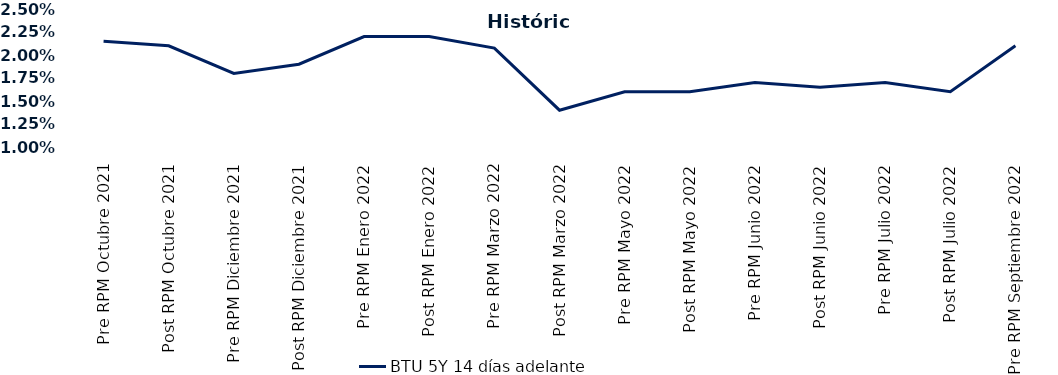
| Category | BTU 5Y 14 días adelante |
|---|---|
| Pre RPM Octubre 2021 | 0.022 |
| Post RPM Octubre 2021 | 0.021 |
| Pre RPM Diciembre 2021 | 0.018 |
| Post RPM Diciembre 2021 | 0.019 |
| Pre RPM Enero 2022 | 0.022 |
| Post RPM Enero 2022 | 0.022 |
| Pre RPM Marzo 2022 | 0.021 |
| Post RPM Marzo 2022 | 0.014 |
| Pre RPM Mayo 2022 | 0.016 |
| Post RPM Mayo 2022 | 0.016 |
| Pre RPM Junio 2022 | 0.017 |
| Post RPM Junio 2022 | 0.016 |
| Pre RPM Julio 2022 | 0.017 |
| Post RPM Julio 2022 | 0.016 |
| Pre RPM Septiembre 2022 | 0.021 |